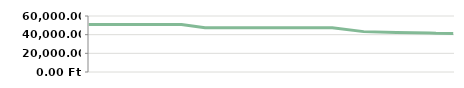
| Category | NEGYEDÉV   |
|---|---|
| 2013-04-23 | 50800 |
| 2013-04-25 | 50800 |
| 2013-05-07 | 50800 |
| 2013-05-14 | 50800 |
| 2013-05-14 | 50800 |
| 2013-05-29 | 50800 |
| 2013-06-10 | 50800 |
| 2013-06-21 | 50800 |
| 2013-07-06 | 47400 |
| 2013-08-05 | 47400 |
| 2013-08-19 | 47400 |
| 2013-09-04 | 47400 |
| 2013-09-20 | 47400 |
| 2013-09-25 | 47400 |
| 2013-10-15 | 43258.14 |
| 2013-11-05 | 42312.903 |
| 2013-11-26 | 41811.111 |
| 2013-11-30 | 41500 |
| 2013-12-11 | 41288.235 |